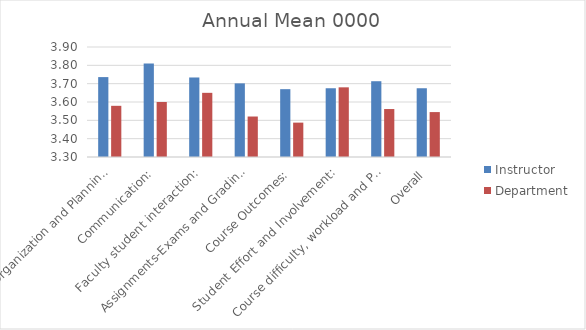
| Category | Instructor | Department |
|---|---|---|
| Course Organization and Planning: | 3.736 | 3.579 |
| Communication: | 3.81 | 3.6 |
| Faculty student interaction: | 3.734 | 3.65 |
| Assignments-Exams and Grading: | 3.702 | 3.521 |
| Course Outcomes: | 3.67 | 3.488 |
| Student Effort and Involvement: | 3.675 | 3.68 |
| Course difficulty, workload and Pace: | 3.713 | 3.562 |
| Overall | 3.675 | 3.545 |